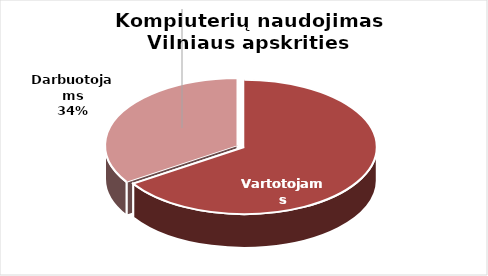
| Category | Series 0 |
|---|---|
| Vartotojams | 785 |
| Darbuotojams | 408 |